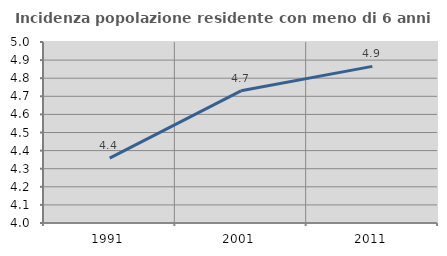
| Category | Incidenza popolazione residente con meno di 6 anni |
|---|---|
| 1991.0 | 4.359 |
| 2001.0 | 4.73 |
| 2011.0 | 4.865 |